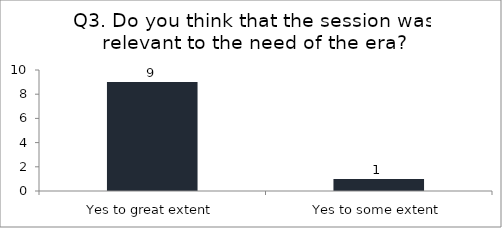
| Category | Q3. Do you think that the session was relevant to the need of the era? |
|---|---|
| Yes to great extent | 9 |
| Yes to some extent | 1 |